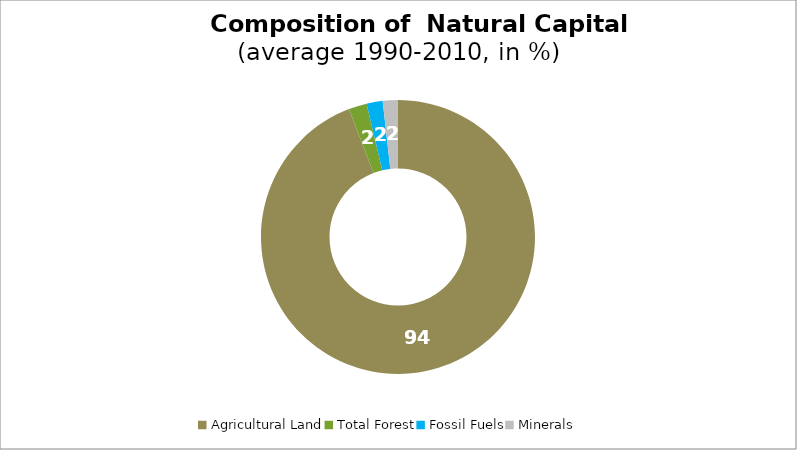
| Category | Series 0 |
|---|---|
| Agricultural Land | 94.175 |
| Total Forest | 2.136 |
| Fossil Fuels | 1.902 |
| Minerals | 1.787 |